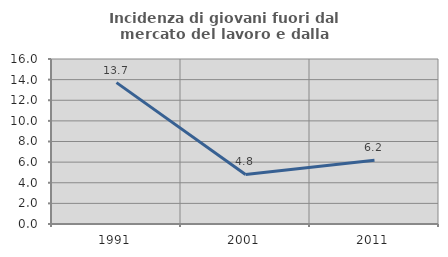
| Category | Incidenza di giovani fuori dal mercato del lavoro e dalla formazione  |
|---|---|
| 1991.0 | 13.71 |
| 2001.0 | 4.808 |
| 2011.0 | 6.186 |